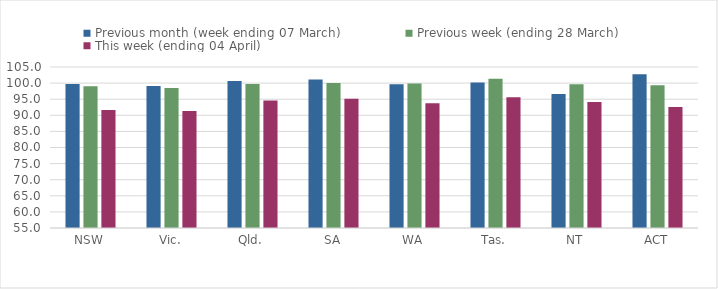
| Category | Previous month (week ending 07 March) | Previous week (ending 28 March) | This week (ending 04 April) |
|---|---|---|---|
| NSW | 99.702 | 98.995 | 91.675 |
| Vic. | 99.08 | 98.484 | 91.301 |
| Qld. | 100.618 | 99.753 | 94.634 |
| SA | 101.098 | 100.005 | 95.123 |
| WA | 99.678 | 99.897 | 93.715 |
| Tas. | 100.214 | 101.388 | 95.601 |
| NT | 96.624 | 99.662 | 94.135 |
| ACT | 102.715 | 99.357 | 92.564 |